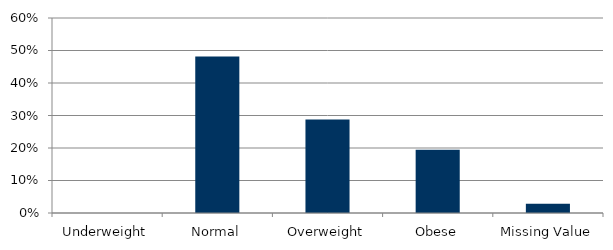
| Category | Total |
|---|---|
| Underweight | 0 |
| Normal | 0.482 |
| Overweight | 0.287 |
| Obese | 0.194 |
| Missing Value | 0.028 |